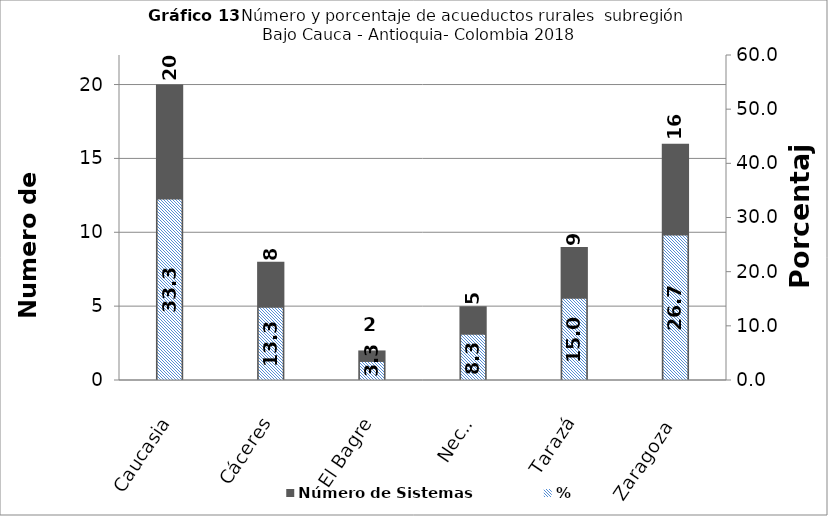
| Category | Número de Sistemas |
|---|---|
| Caucasia | 20 |
| Cáceres | 8 |
| El Bagre | 2 |
| Nechi | 5 |
| Tarazá | 9 |
| Zaragoza | 16 |